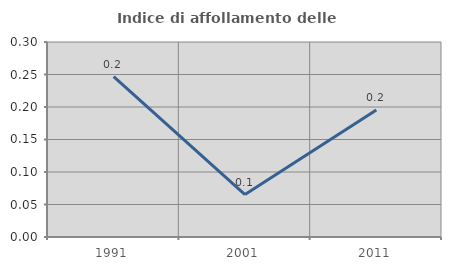
| Category | Indice di affollamento delle abitazioni  |
|---|---|
| 1991.0 | 0.247 |
| 2001.0 | 0.065 |
| 2011.0 | 0.195 |